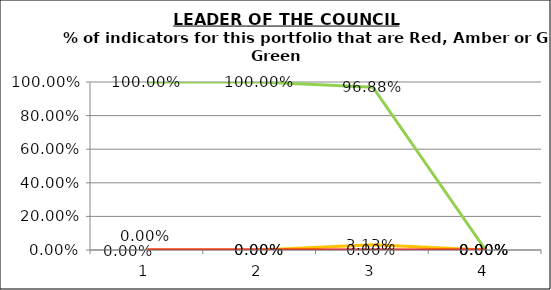
| Category | Green | Amber | Red |
|---|---|---|---|
| 0 | 1 | 0 | 0 |
| 1 | 1 | 0 | 0 |
| 2 | 0.969 | 0.031 | 0 |
| 3 | 0 | 0 | 0 |